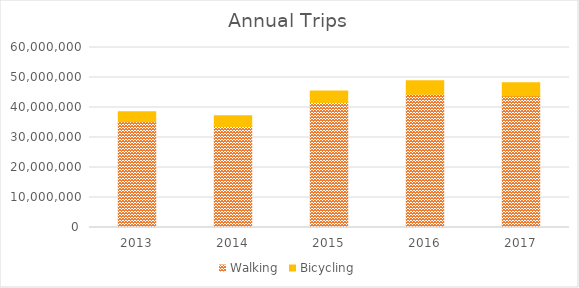
| Category | Walking | Bicycling |
|---|---|---|
| 2013 | 35223941.289 | 3397591.94 |
| 2014 | 33657243.73 | 3588744.42 |
| 2015 | 41667582.017 | 3858575.157 |
| 2016 | 44422140.208 | 4475089.311 |
| 2017 | 43868433.254 | 4399437.925 |